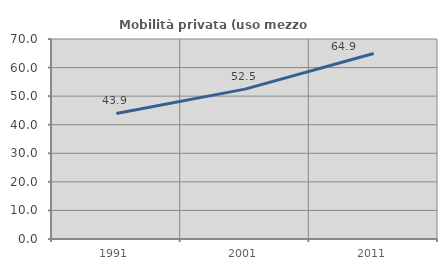
| Category | Mobilità privata (uso mezzo privato) |
|---|---|
| 1991.0 | 43.938 |
| 2001.0 | 52.457 |
| 2011.0 | 64.908 |